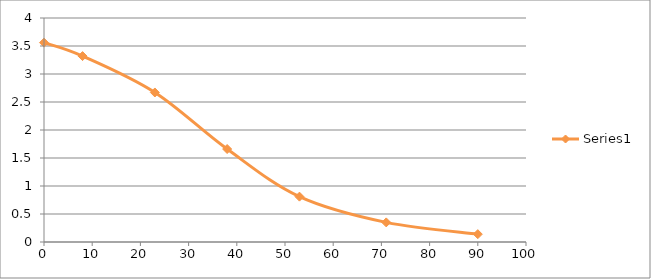
| Category | Series 0 |
|---|---|
| 0.0 | 3.56 |
| 8.0 | 3.32 |
| 23.0 | 2.67 |
| 38.0 | 1.66 |
| 53.0 | 0.81 |
| 71.0 | 0.35 |
| 90.0 | 0.14 |